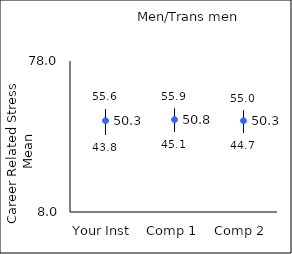
| Category | 25th percentile | 75th percentile | Mean |
|---|---|---|---|
| Your Inst | 43.8 | 55.6 | 50.32 |
| Comp 1 | 45.1 | 55.9 | 50.82 |
| Comp 2 | 44.7 | 55 | 50.3 |